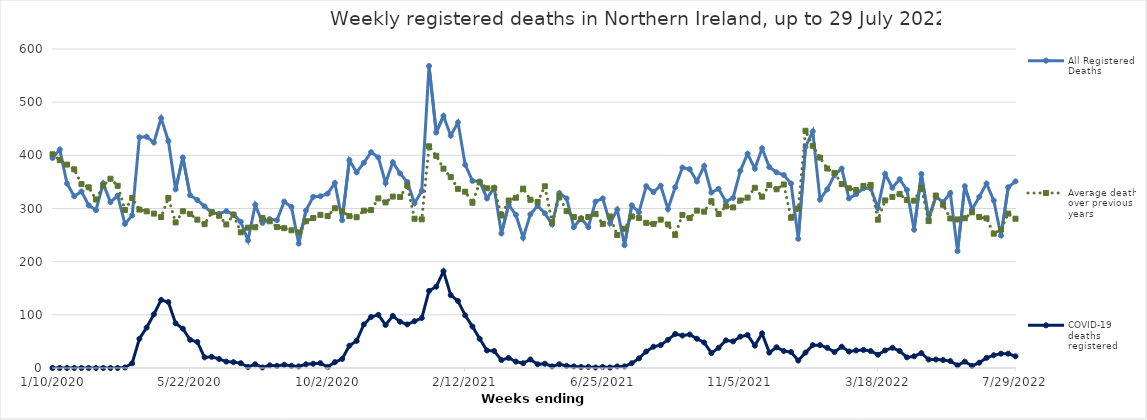
| Category | All Registered Deaths | Average deaths over previous 5 years | COVID-19 deaths registered |
|---|---|---|---|
| 1/10/20 | 395 | 402 | 0 |
| 1/17/20 | 411 | 391 | 0 |
| 1/24/20 | 347 | 382.6 | 0 |
| 1/31/20 | 323 | 373.6 | 0 |
| 2/7/20 | 332 | 345.8 | 0 |
| 2/14/20 | 306 | 339.8 | 0 |
| 2/21/20 | 297 | 317 | 0 |
| 2/28/20 | 347 | 343 | 0 |
| 3/6/20 | 312 | 356 | 0 |
| 3/13/20 | 324 | 342.8 | 0 |
| 3/20/20 | 271 | 297.2 | 1 |
| 3/27/20 | 287 | 319.6 | 9 |
| 4/3/20 | 434 | 298 | 55 |
| 4/10/20 | 435 | 294.6 | 76 |
| 4/17/20 | 424 | 290.4 | 101 |
| 4/24/20 | 470 | 283.8 | 128 |
| 5/1/20 | 427 | 319.6 | 124 |
| 5/8/20 | 336 | 273.8 | 84 |
| 5/15/20 | 396 | 294.8 | 74 |
| 5/22/20 | 325 | 289.8 | 53 |
| 5/29/20 | 316 | 279 | 49 |
| 6/5/20 | 304 | 270.6 | 20 |
| 6/12/20 | 292 | 293.2 | 21 |
| 6/19/20 | 290 | 286.4 | 17 |
| 6/26/20 | 295 | 270 | 12 |
| 7/3/20 | 289 | 288.2 | 11 |
| 7/10/20 | 275 | 255.2 | 9 |
| 7/17/20 | 240 | 264 | 2 |
| 7/24/20 | 307 | 264.6 | 7 |
| 7/31/20 | 273 | 282 | 1 |
| 8/7/20 | 280 | 276 | 5 |
| 8/14/20 | 278 | 265 | 4 |
| 8/21/20 | 313 | 263 | 6 |
| 8/28/20 | 303 | 259 | 4 |
| 9/4/20 | 234 | 255 | 3 |
| 9/11/20 | 296 | 276 | 7 |
| 9/18/20 | 322 | 282 | 8 |
| 9/25/20 | 323 | 288 | 9 |
| 10/2/20 | 328 | 286 | 2 |
| 10/9/20 | 348 | 300.4 | 11 |
| 10/16/20 | 278 | 294.8 | 17 |
| 10/23/20 | 391 | 285.6 | 42 |
| 10/30/20 | 368 | 283.6 | 51 |
| 11/6/20 | 386 | 296 | 82 |
| 11/13/20 | 406 | 297 | 96 |
| 11/20/20 | 396 | 319 | 100 |
| 11/27/20 | 348 | 311.4 | 81 |
| 12/4/20 | 387 | 322.4 | 98 |
| 12/11/20 | 366 | 321.8 | 87 |
| 12/18/20 | 350 | 343.8 | 82 |
| 12/25/20 | 310 | 280.8 | 88 |
| 1/1/21 | 333 | 279.6 | 94 |
| 1/8/21 | 568 | 417 | 145 |
| 1/15/21 | 443 | 399 | 153 |
| 1/22/21 | 474 | 375 | 182 |
| 1/29/21 | 437 | 359 | 137 |
| 2/5/21 | 462 | 337 | 126 |
| 2/12/21 | 382 | 331.6 | 99 |
| 2/19/21 | 352 | 310.8 | 78 |
| 2/26/21 | 351 | 349 | 55 |
| 3/5/21 | 319 | 338 | 33 |
| 3/12/21 | 339 | 338 | 32 |
| 3/19/21 | 253 | 286.8 | 15 |
| 3/26/21 | 307 | 315 | 19 |
| 4/2/21 | 288 | 320.2 | 12 |
| 4/9/21 | 245 | 337.4 | 9 |
| 4/16/21 | 289 | 316.4 | 16 |
| 4/23/21 | 305 | 312.4 | 7 |
| 4/30/21 | 291 | 341.8 | 8 |
| 5/7/21 | 270 | 274 | 3 |
| 5/14/21 | 329 | 323 | 7 |
| 5/21/21 | 319 | 295 | 4 |
| 5/28/21 | 265 | 284 | 3 |
| 6/4/21 | 282 | 280 | 2 |
| 6/11/21 | 265 | 284 | 2 |
| 6/18/21 | 313 | 290 | 1 |
| 6/25/21 | 319 | 271 | 2 |
| 7/2/21 | 272 | 285 | 1 |
| 7/9/21 | 298 | 250 | 3 |
| 7/16/21 | 231 | 262 | 3 |
| 7/23/21 | 306 | 285 | 9 |
| 7/30/21 | 293 | 282 | 18 |
| 8/6/21 | 342 | 273 | 31 |
| 8/13/21 | 331 | 271 | 40 |
| 8/20/21 | 343 | 279 | 43 |
| 8/27/21 | 299 | 270 | 53 |
| 9/3/21 | 340 | 250 | 64 |
| 9/10/21 | 377 | 288 | 61 |
| 9/17/21 | 374 | 282 | 63 |
| 9/24/21 | 351 | 296 | 55 |
| 10/1/21 | 380 | 294 | 48 |
| 10/8/21 | 330 | 313.6 | 28 |
| 10/15/21 | 337 | 289.6 | 38 |
| 10/22/21 | 313 | 304 | 52 |
| 10/29/21 | 320 | 302 | 50 |
| 11/5/21 | 371 | 315 | 59 |
| 11/12/21 | 403 | 320.4 | 62 |
| 11/19/21 | 375 | 339 | 42 |
| 11/26/21 | 413 | 322.2 | 65 |
| 12/3/21 | 378 | 344 | 29 |
| 12/10/21 | 368 | 336.2 | 39 |
| 12/17/21 | 363 | 345.2 | 32 |
| 12/24/21 | 347 | 282.6 | 30 |
| 12/31/21 | 243 | 299.8 | 14 |
| 1/7/22 | 416 | 446.2 | 29 |
| 1/14/22 | 445 | 418 | 43 |
| 1/21/22 | 317 | 395.8 | 43 |
| 1/28/22 | 336 | 375.2 | 38 |
| 2/4/22 | 363 | 367 | 30 |
| 2/11/22 | 375 | 346 | 40 |
| 2/18/22 | 319 | 338 | 31 |
| 2/25/22 | 327 | 334.6 | 33 |
| 3/4/22 | 338 | 342.4 | 34 |
| 3/11/22 | 338 | 344.4 | 32 |
| 3/18/22 | 301 | 279 | 25 |
| 3/25/22 | 365 | 315.2 | 33 |
| 4/1/22 | 339 | 321.8 | 38 |
| 4/8/22 | 355 | 327.4 | 32 |
| 4/15/22 | 335 | 315.8 | 20 |
| 4/22/22 | 260 | 314.8 | 22 |
| 4/29/22 | 365 | 338.8 | 28 |
| 5/6/22 | 281 | 276.4 | 16 |
| 5/13/22 | 322 | 324.4 | 16 |
| 5/20/22 | 312 | 307 | 15 |
| 5/27/22 | 329 | 281.2 | 13 |
| 6/3/22 | 220 | 279.4 | 5 |
| 6/10/22 | 342 | 281.6 | 12 |
| 6/17/22 | 298 | 292.8 | 4 |
| 6/24/22 | 322 | 284 | 10 |
| 7/1/22 | 347 | 281.6 | 19 |
| 7/8/22 | 315 | 252.6 | 24 |
| 7/15/22 | 249 | 260.4 | 27 |
| 7/22/22 | 340 | 290.4 | 27 |
| 7/29/22 | 351 | 280.8 | 22 |